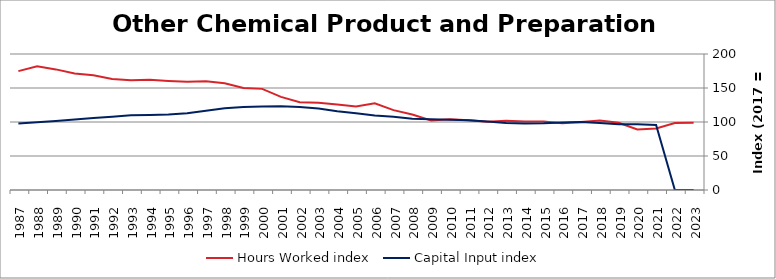
| Category | Hours Worked index | Capital Input index |
|---|---|---|
| 2023.0 | 98.846 | 0 |
| 2022.0 | 98.598 | 0 |
| 2021.0 | 90.554 | 95.54 |
| 2020.0 | 88.896 | 96.621 |
| 2019.0 | 98.937 | 96.732 |
| 2018.0 | 102.032 | 98.36 |
| 2017.0 | 100 | 100 |
| 2016.0 | 98.166 | 99.376 |
| 2015.0 | 100.761 | 98.192 |
| 2014.0 | 100.869 | 97.624 |
| 2013.0 | 101.999 | 98.649 |
| 2012.0 | 100.331 | 100.594 |
| 2011.0 | 102.421 | 102.408 |
| 2010.0 | 104.041 | 103.213 |
| 2009.0 | 102.202 | 103.95 |
| 2008.0 | 110.91 | 104.803 |
| 2007.0 | 117.422 | 107.814 |
| 2006.0 | 127.448 | 109.541 |
| 2005.0 | 122.875 | 112.845 |
| 2004.0 | 125.827 | 115.901 |
| 2003.0 | 128.145 | 119.784 |
| 2002.0 | 129.005 | 122.127 |
| 2001.0 | 136.934 | 123.316 |
| 2000.0 | 148.718 | 122.881 |
| 1999.0 | 150.071 | 122.156 |
| 1998.0 | 157.004 | 120.275 |
| 1997.0 | 160.096 | 116.38 |
| 1996.0 | 159.034 | 112.878 |
| 1995.0 | 160.301 | 111.152 |
| 1994.0 | 162.112 | 110.453 |
| 1993.0 | 161.418 | 109.759 |
| 1992.0 | 163.136 | 107.838 |
| 1991.0 | 168.582 | 105.857 |
| 1990.0 | 171.32 | 103.841 |
| 1989.0 | 177.36 | 101.62 |
| 1988.0 | 182.062 | 99.62 |
| 1987.0 | 174.778 | 97.77 |